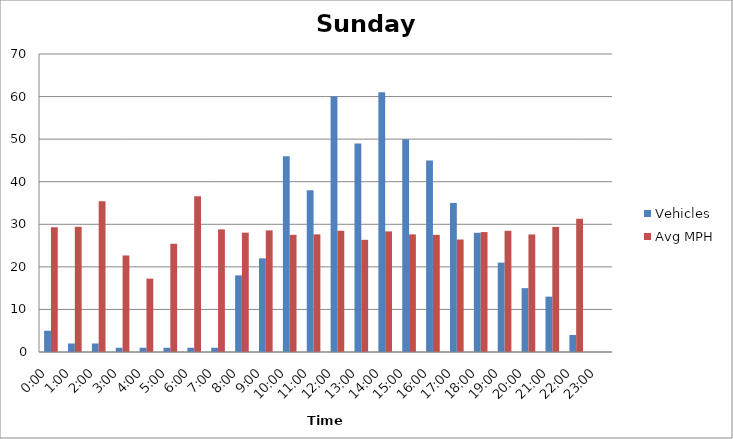
| Category | Vehicles | Avg MPH |
|---|---|---|
| 0:00 | 5 | 29.3 |
| 1:00 | 2 | 29.41 |
| 2:00 | 2 | 35.4 |
| 3:00 | 1 | 22.68 |
| 4:00 | 1 | 17.23 |
| 5:00 | 1 | 25.43 |
| 6:00 | 1 | 36.58 |
| 7:00 | 1 | 28.8 |
| 8:00 | 18 | 28.03 |
| 9:00 | 22 | 28.57 |
| 10:00 | 46 | 27.52 |
| 11:00 | 38 | 27.63 |
| 12:00 | 60 | 28.48 |
| 13:00 | 49 | 26.35 |
| 14:00 | 61 | 28.33 |
| 15:00 | 50 | 27.63 |
| 16:00 | 45 | 27.52 |
| 17:00 | 35 | 26.42 |
| 18:00 | 28 | 28.17 |
| 19:00 | 21 | 28.47 |
| 20:00 | 15 | 27.61 |
| 21:00 | 13 | 29.38 |
| 22:00 | 4 | 31.28 |
| 23:00 | 0 | 0 |